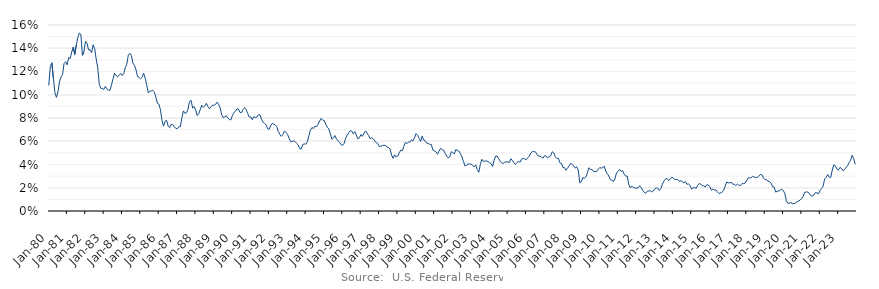
| Category | Series 0 |
|---|---|
| 1980-01-01 | 0.108 |
| 1980-02-01 | 0.124 |
| 1980-03-01 | 0.128 |
| 1980-04-01 | 0.115 |
| 1980-05-01 | 0.102 |
| 1980-06-01 | 0.098 |
| 1980-07-01 | 0.102 |
| 1980-08-01 | 0.111 |
| 1980-09-01 | 0.115 |
| 1980-10-01 | 0.118 |
| 1980-11-01 | 0.127 |
| 1980-12-01 | 0.128 |
| 1981-01-01 | 0.126 |
| 1981-02-01 | 0.132 |
| 1981-03-01 | 0.131 |
| 1981-04-01 | 0.137 |
| 1981-05-01 | 0.141 |
| 1981-06-01 | 0.135 |
| 1981-07-01 | 0.143 |
| 1981-08-01 | 0.149 |
| 1981-09-01 | 0.153 |
| 1981-10-01 | 0.152 |
| 1981-11-01 | 0.134 |
| 1981-12-01 | 0.137 |
| 1982-01-01 | 0.146 |
| 1982-02-01 | 0.144 |
| 1982-03-01 | 0.139 |
| 1982-04-01 | 0.139 |
| 1982-05-01 | 0.136 |
| 1982-06-01 | 0.143 |
| 1982-07-01 | 0.139 |
| 1982-08-01 | 0.131 |
| 1982-09-01 | 0.123 |
| 1982-10-01 | 0.109 |
| 1982-11-01 | 0.106 |
| 1982-12-01 | 0.105 |
| 1983-01-01 | 0.105 |
| 1983-02-01 | 0.107 |
| 1983-03-01 | 0.105 |
| 1983-04-01 | 0.104 |
| 1983-05-01 | 0.104 |
| 1983-06-01 | 0.108 |
| 1983-07-01 | 0.114 |
| 1983-08-01 | 0.118 |
| 1983-09-01 | 0.116 |
| 1983-10-01 | 0.115 |
| 1983-11-01 | 0.117 |
| 1983-12-01 | 0.118 |
| 1984-01-01 | 0.117 |
| 1984-02-01 | 0.118 |
| 1984-03-01 | 0.123 |
| 1984-04-01 | 0.126 |
| 1984-05-01 | 0.134 |
| 1984-06-01 | 0.136 |
| 1984-07-01 | 0.134 |
| 1984-08-01 | 0.127 |
| 1984-09-01 | 0.125 |
| 1984-10-01 | 0.122 |
| 1984-11-01 | 0.116 |
| 1984-12-01 | 0.115 |
| 1985-01-01 | 0.114 |
| 1985-02-01 | 0.115 |
| 1985-03-01 | 0.119 |
| 1985-04-01 | 0.114 |
| 1985-05-01 | 0.108 |
| 1985-06-01 | 0.102 |
| 1985-07-01 | 0.103 |
| 1985-08-01 | 0.103 |
| 1985-09-01 | 0.104 |
| 1985-10-01 | 0.102 |
| 1985-11-01 | 0.098 |
| 1985-12-01 | 0.093 |
| 1986-01-01 | 0.092 |
| 1986-02-01 | 0.087 |
| 1986-03-01 | 0.078 |
| 1986-04-01 | 0.073 |
| 1986-05-01 | 0.077 |
| 1986-06-01 | 0.078 |
| 1986-07-01 | 0.073 |
| 1986-08-01 | 0.072 |
| 1986-09-01 | 0.074 |
| 1986-10-01 | 0.074 |
| 1986-11-01 | 0.072 |
| 1986-12-01 | 0.071 |
| 1987-01-01 | 0.071 |
| 1987-02-01 | 0.072 |
| 1987-03-01 | 0.072 |
| 1987-04-01 | 0.08 |
| 1987-05-01 | 0.086 |
| 1987-06-01 | 0.084 |
| 1987-07-01 | 0.084 |
| 1987-08-01 | 0.088 |
| 1987-09-01 | 0.094 |
| 1987-10-01 | 0.095 |
| 1987-11-01 | 0.089 |
| 1987-12-01 | 0.09 |
| 1988-01-01 | 0.087 |
| 1988-02-01 | 0.082 |
| 1988-03-01 | 0.084 |
| 1988-04-01 | 0.087 |
| 1988-05-01 | 0.091 |
| 1988-06-01 | 0.089 |
| 1988-07-01 | 0.091 |
| 1988-08-01 | 0.093 |
| 1988-09-01 | 0.09 |
| 1988-10-01 | 0.088 |
| 1988-11-01 | 0.09 |
| 1988-12-01 | 0.091 |
| 1989-01-01 | 0.091 |
| 1989-02-01 | 0.092 |
| 1989-03-01 | 0.094 |
| 1989-04-01 | 0.092 |
| 1989-05-01 | 0.089 |
| 1989-06-01 | 0.083 |
| 1989-07-01 | 0.08 |
| 1989-08-01 | 0.081 |
| 1989-09-01 | 0.082 |
| 1989-10-01 | 0.08 |
| 1989-11-01 | 0.079 |
| 1989-12-01 | 0.078 |
| 1990-01-01 | 0.082 |
| 1990-02-01 | 0.085 |
| 1990-03-01 | 0.086 |
| 1990-04-01 | 0.088 |
| 1990-05-01 | 0.088 |
| 1990-06-01 | 0.085 |
| 1990-07-01 | 0.085 |
| 1990-08-01 | 0.088 |
| 1990-09-01 | 0.089 |
| 1990-10-01 | 0.087 |
| 1990-11-01 | 0.084 |
| 1990-12-01 | 0.081 |
| 1991-01-01 | 0.081 |
| 1991-02-01 | 0.078 |
| 1991-03-01 | 0.081 |
| 1991-04-01 | 0.08 |
| 1991-05-01 | 0.081 |
| 1991-06-01 | 0.083 |
| 1991-07-01 | 0.083 |
| 1991-08-01 | 0.079 |
| 1991-09-01 | 0.076 |
| 1991-10-01 | 0.075 |
| 1991-11-01 | 0.074 |
| 1991-12-01 | 0.071 |
| 1992-01-01 | 0.07 |
| 1992-02-01 | 0.073 |
| 1992-03-01 | 0.075 |
| 1992-04-01 | 0.075 |
| 1992-05-01 | 0.074 |
| 1992-06-01 | 0.073 |
| 1992-07-01 | 0.068 |
| 1992-08-01 | 0.066 |
| 1992-09-01 | 0.064 |
| 1992-10-01 | 0.066 |
| 1992-11-01 | 0.069 |
| 1992-12-01 | 0.068 |
| 1993-01-01 | 0.066 |
| 1993-02-01 | 0.063 |
| 1993-03-01 | 0.06 |
| 1993-04-01 | 0.06 |
| 1993-05-01 | 0.06 |
| 1993-06-01 | 0.06 |
| 1993-07-01 | 0.058 |
| 1993-08-01 | 0.057 |
| 1993-09-01 | 0.054 |
| 1993-10-01 | 0.053 |
| 1993-11-01 | 0.057 |
| 1993-12-01 | 0.058 |
| 1994-01-01 | 0.058 |
| 1994-02-01 | 0.06 |
| 1994-03-01 | 0.065 |
| 1994-04-01 | 0.07 |
| 1994-05-01 | 0.072 |
| 1994-06-01 | 0.071 |
| 1994-07-01 | 0.073 |
| 1994-08-01 | 0.072 |
| 1994-09-01 | 0.075 |
| 1994-10-01 | 0.077 |
| 1994-11-01 | 0.08 |
| 1994-12-01 | 0.078 |
| 1995-01-01 | 0.078 |
| 1995-02-01 | 0.075 |
| 1995-03-01 | 0.072 |
| 1995-04-01 | 0.071 |
| 1995-05-01 | 0.066 |
| 1995-06-01 | 0.062 |
| 1995-07-01 | 0.063 |
| 1995-08-01 | 0.065 |
| 1995-09-01 | 0.062 |
| 1995-10-01 | 0.06 |
| 1995-11-01 | 0.059 |
| 1995-12-01 | 0.057 |
| 1996-01-01 | 0.056 |
| 1996-02-01 | 0.058 |
| 1996-03-01 | 0.063 |
| 1996-04-01 | 0.065 |
| 1996-05-01 | 0.067 |
| 1996-06-01 | 0.069 |
| 1996-07-01 | 0.069 |
| 1996-08-01 | 0.066 |
| 1996-09-01 | 0.068 |
| 1996-10-01 | 0.065 |
| 1996-11-01 | 0.062 |
| 1996-12-01 | 0.063 |
| 1997-01-01 | 0.066 |
| 1997-02-01 | 0.064 |
| 1997-03-01 | 0.067 |
| 1997-04-01 | 0.069 |
| 1997-05-01 | 0.067 |
| 1997-06-01 | 0.065 |
| 1997-07-01 | 0.062 |
| 1997-08-01 | 0.063 |
| 1997-09-01 | 0.062 |
| 1997-10-01 | 0.06 |
| 1997-11-01 | 0.059 |
| 1997-12-01 | 0.058 |
| 1998-01-01 | 0.055 |
| 1998-02-01 | 0.056 |
| 1998-03-01 | 0.056 |
| 1998-04-01 | 0.056 |
| 1998-05-01 | 0.056 |
| 1998-06-01 | 0.055 |
| 1998-07-01 | 0.055 |
| 1998-08-01 | 0.053 |
| 1998-09-01 | 0.048 |
| 1998-10-01 | 0.045 |
| 1998-11-01 | 0.048 |
| 1998-12-01 | 0.047 |
| 1999-01-01 | 0.047 |
| 1999-02-01 | 0.05 |
| 1999-03-01 | 0.052 |
| 1999-04-01 | 0.052 |
| 1999-05-01 | 0.055 |
| 1999-06-01 | 0.059 |
| 1999-07-01 | 0.058 |
| 1999-08-01 | 0.059 |
| 1999-09-01 | 0.059 |
| 1999-10-01 | 0.061 |
| 1999-11-01 | 0.06 |
| 1999-12-01 | 0.063 |
| 2000-01-01 | 0.067 |
| 2000-02-01 | 0.065 |
| 2000-03-01 | 0.063 |
| 2000-04-01 | 0.06 |
| 2000-05-01 | 0.064 |
| 2000-06-01 | 0.061 |
| 2000-07-01 | 0.06 |
| 2000-08-01 | 0.058 |
| 2000-09-01 | 0.058 |
| 2000-10-01 | 0.057 |
| 2000-11-01 | 0.057 |
| 2000-12-01 | 0.052 |
| 2001-01-01 | 0.052 |
| 2001-02-01 | 0.051 |
| 2001-03-01 | 0.049 |
| 2001-04-01 | 0.051 |
| 2001-05-01 | 0.054 |
| 2001-06-01 | 0.053 |
| 2001-07-01 | 0.052 |
| 2001-08-01 | 0.05 |
| 2001-09-01 | 0.047 |
| 2001-10-01 | 0.046 |
| 2001-11-01 | 0.047 |
| 2001-12-01 | 0.051 |
| 2002-01-01 | 0.05 |
| 2002-02-01 | 0.049 |
| 2002-03-01 | 0.053 |
| 2002-04-01 | 0.052 |
| 2002-05-01 | 0.052 |
| 2002-06-01 | 0.049 |
| 2002-07-01 | 0.047 |
| 2002-08-01 | 0.043 |
| 2002-09-01 | 0.039 |
| 2002-10-01 | 0.039 |
| 2002-11-01 | 0.04 |
| 2002-12-01 | 0.04 |
| 2003-01-01 | 0.04 |
| 2003-02-01 | 0.039 |
| 2003-03-01 | 0.038 |
| 2003-04-01 | 0.04 |
| 2003-05-01 | 0.036 |
| 2003-06-01 | 0.033 |
| 2003-07-01 | 0.04 |
| 2003-08-01 | 0.045 |
| 2003-09-01 | 0.043 |
| 2003-10-01 | 0.043 |
| 2003-11-01 | 0.043 |
| 2003-12-01 | 0.043 |
| 2004-01-01 | 0.042 |
| 2004-02-01 | 0.041 |
| 2004-03-01 | 0.038 |
| 2004-04-01 | 0.044 |
| 2004-05-01 | 0.047 |
| 2004-06-01 | 0.047 |
| 2004-07-01 | 0.045 |
| 2004-08-01 | 0.043 |
| 2004-09-01 | 0.041 |
| 2004-10-01 | 0.041 |
| 2004-11-01 | 0.042 |
| 2004-12-01 | 0.042 |
| 2005-01-01 | 0.042 |
| 2005-02-01 | 0.042 |
| 2005-03-01 | 0.045 |
| 2005-04-01 | 0.043 |
| 2005-05-01 | 0.041 |
| 2005-06-01 | 0.04 |
| 2005-07-01 | 0.042 |
| 2005-08-01 | 0.043 |
| 2005-09-01 | 0.042 |
| 2005-10-01 | 0.045 |
| 2005-11-01 | 0.045 |
| 2005-12-01 | 0.045 |
| 2006-01-06 | 0.044 |
| 2006-02-01 | 0.046 |
| 2006-03-01 | 0.047 |
| 2006-04-01 | 0.05 |
| 2006-05-01 | 0.051 |
| 2006-06-01 | 0.051 |
| 2006-07-01 | 0.051 |
| 2006-08-01 | 0.049 |
| 2006-09-01 | 0.047 |
| 2006-10-01 | 0.047 |
| 2006-11-01 | 0.046 |
| 2006-12-01 | 0.046 |
| 2007-01-01 | 0.048 |
| 2007-02-01 | 0.047 |
| 2007-03-01 | 0.046 |
| 2007-04-01 | 0.047 |
| 2007-05-01 | 0.048 |
| 2007-06-01 | 0.051 |
| 2007-07-07 | 0.05 |
| 2007-08-07 | 0.047 |
| 2007-09-07 | 0.045 |
| 2007-10-07 | 0.045 |
| 2007-11-07 | 0.042 |
| 2007-12-07 | 0.041 |
| 2008-01-01 | 0.037 |
| 2008-02-01 | 0.037 |
| 2008-03-01 | 0.035 |
| 2008-04-01 | 0.037 |
| 2008-05-01 | 0.039 |
| 2008-06-01 | 0.041 |
| 2008-07-01 | 0.04 |
| 2008-08-01 | 0.039 |
| 2008-09-01 | 0.037 |
| 2008-10-01 | 0.038 |
| 2008-11-01 | 0.035 |
| 2008-12-01 | 0.024 |
| 2009-01-01 | 0.025 |
| 2009-02-01 | 0.029 |
| 2009-03-01 | 0.028 |
| 2009-04-01 | 0.029 |
| 2009-05-01 | 0.033 |
| 2009-06-01 | 0.037 |
| 2009-07-01 | 0.036 |
| 2009-08-01 | 0.036 |
| 2009-09-01 | 0.034 |
| 2009-10-01 | 0.034 |
| 2009-11-01 | 0.034 |
| 2009-12-01 | 0.036 |
| 2010-01-01 | 0.037 |
| 2010-02-01 | 0.037 |
| 2010-03-01 | 0.037 |
| 2010-04-01 | 0.038 |
| 2010-05-01 | 0.034 |
| 2010-06-01 | 0.032 |
| 2010-07-01 | 0.03 |
| 2010-08-01 | 0.027 |
| 2010-09-01 | 0.026 |
| 2010-10-01 | 0.025 |
| 2010-11-01 | 0.028 |
| 2010-12-01 | 0.033 |
| 2011-01-01 | 0.034 |
| 2011-02-01 | 0.036 |
| 2011-03-01 | 0.034 |
| 2011-04-01 | 0.035 |
| 2011-05-01 | 0.032 |
| 2011-06-01 | 0.03 |
| 2011-07-01 | 0.03 |
| 2011-08-01 | 0.023 |
| 2011-09-01 | 0.02 |
| 2011-10-01 | 0.022 |
| 2011-11-01 | 0.02 |
| 2011-12-01 | 0.02 |
| 2012-01-01 | 0.02 |
| 2012-02-01 | 0.02 |
| 2012-03-01 | 0.022 |
| 2012-04-01 | 0.02 |
| 2012-05-01 | 0.018 |
| 2012-06-01 | 0.016 |
| 2012-07-01 | 0.015 |
| 2012-08-01 | 0.017 |
| 2012-09-01 | 0.017 |
| 2012-10-01 | 0.018 |
| 2012-11-01 | 0.016 |
| 2012-12-01 | 0.017 |
| 2013-01-01 | 0.019 |
| 2013-02-01 | 0.02 |
| 2013-03-01 | 0.02 |
| 2013-04-01 | 0.018 |
| 2013-05-01 | 0.019 |
| 2013-06-01 | 0.023 |
| 2013-07-01 | 0.026 |
| 2013-08-01 | 0.027 |
| 2013-09-01 | 0.028 |
| 2013-10-01 | 0.026 |
| 2013-11-01 | 0.027 |
| 2013-12-01 | 0.029 |
| 2014-01-01 | 0.029 |
| 2014-02-01 | 0.027 |
| 2014-03-01 | 0.027 |
| 2014-04-01 | 0.027 |
| 2014-05-01 | 0.026 |
| 2014-06-01 | 0.026 |
| 2014-07-01 | 0.025 |
| 2014-08-01 | 0.024 |
| 2014-09-01 | 0.025 |
| 2014-10-01 | 0.023 |
| 2014-11-01 | 0.023 |
| 2014-12-01 | 0.022 |
| 2015-01-01 | 0.019 |
| 2015-02-01 | 0.02 |
| 2015-03-01 | 0.02 |
| 2015-04-01 | 0.019 |
| 2015-05-01 | 0.022 |
| 2015-06-01 | 0.024 |
| 2015-07-01 | 0.023 |
| 2015-08-01 | 0.022 |
| 2015-09-01 | 0.022 |
| 2015-10-01 | 0.021 |
| 2015-11-01 | 0.023 |
| 2015-12-01 | 0.022 |
| 2016-01-01 | 0.021 |
| 2016-02-01 | 0.018 |
| 2016-03-01 | 0.019 |
| 2016-04-01 | 0.018 |
| 2016-05-01 | 0.018 |
| 2016-06-01 | 0.016 |
| 2016-07-01 | 0.015 |
| 2016-08-01 | 0.016 |
| 2016-09-01 | 0.016 |
| 2016-10-01 | 0.018 |
| 2016-11-01 | 0.021 |
| 2016-12-01 | 0.025 |
| 2017-01-01 | 0.024 |
| 2017-02-01 | 0.024 |
| 2017-03-01 | 0.025 |
| 2017-04-01 | 0.023 |
| 2017-05-01 | 0.023 |
| 2017-06-01 | 0.022 |
| 2017-07-01 | 0.023 |
| 2017-08-01 | 0.022 |
| 2017-09-01 | 0.022 |
| 2017-10-01 | 0.024 |
| 2017-11-01 | 0.024 |
| 2017-12-01 | 0.024 |
| 2018-01-01 | 0.026 |
| 2018-02-01 | 0.029 |
| 2018-03-01 | 0.028 |
| 2018-04-01 | 0.029 |
| 2018-05-01 | 0.03 |
| 2018-06-01 | 0.029 |
| 2018-07-01 | 0.029 |
| 2018-08-01 | 0.029 |
| 2018-09-01 | 0.03 |
| 2018-10-01 | 0.032 |
| 2018-11-01 | 0.031 |
| 2018-12-01 | 0.028 |
| 2019-01-01 | 0.027 |
| 2019-02-01 | 0.027 |
| 2019-03-01 | 0.026 |
| 2019-04-01 | 0.025 |
| 2019-05-01 | 0.024 |
| 2019-06-01 | 0.021 |
| 2019-07-01 | 0.021 |
| 2019-08-01 | 0.016 |
| 2019-09-01 | 0.017 |
| 2019-10-01 | 0.017 |
| 2019-11-01 | 0.018 |
| 2019-12-01 | 0.019 |
| 2020-01-01 | 0.018 |
| 2020-02-01 | 0.015 |
| 2020-03-01 | 0.009 |
| 2020-04-01 | 0.007 |
| 2020-05-01 | 0.007 |
| 2020-06-01 | 0.007 |
| 2020-07-01 | 0.006 |
| 2020-08-01 | 0.007 |
| 2020-09-01 | 0.007 |
| 2020-10-01 | 0.008 |
| 2020-11-01 | 0.009 |
| 2020-12-01 | 0.009 |
| 2021-01-01 | 0.011 |
| 2021-02-01 | 0.013 |
| 2021-03-01 | 0.016 |
| 2021-04-01 | 0.016 |
| 2021-05-01 | 0.016 |
| 2021-06-01 | 0.015 |
| 2021-07-01 | 0.013 |
| 2021-08-01 | 0.013 |
| 2021-09-01 | 0.014 |
| 2021-10-01 | 0.016 |
| 2021-11-01 | 0.016 |
| 2021-12-01 | 0.015 |
| 2022-01-01 | 0.018 |
| 2022-02-01 | 0.019 |
| 2022-03-01 | 0.021 |
| 2022-04-01 | 0.028 |
| 2022-05-01 | 0.029 |
| 2022-06-01 | 0.031 |
| 2022-07-01 | 0.029 |
| 2022-08-01 | 0.029 |
| 2022-09-01 | 0.035 |
| 2022-10-01 | 0.04 |
| 2022-11-01 | 0.039 |
| 2022-12-01 | 0.036 |
| 2023-01-01 | 0.035 |
| 2023-02-01 | 0.038 |
| 2023-03-01 | 0.037 |
| 2023-04-01 | 0.035 |
| 2023-05-01 | 0.036 |
| 2023-06-01 | 0.038 |
| 2023-07-01 | 0.039 |
| 2023-08-01 | 0.042 |
| 2023-09-01 | 0.044 |
| 2023-10-01 | 0.048 |
| 2023-11-01 | 0.045 |
| 2023-12-01 | 0.04 |